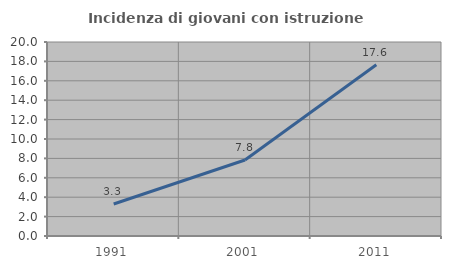
| Category | Incidenza di giovani con istruzione universitaria |
|---|---|
| 1991.0 | 3.299 |
| 2001.0 | 7.832 |
| 2011.0 | 17.647 |